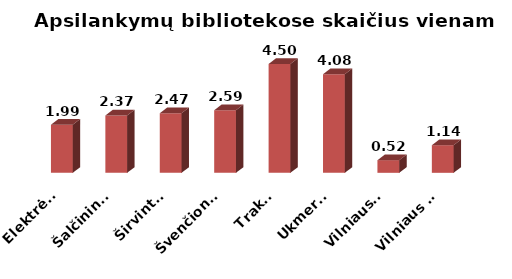
| Category | Series 0 |
|---|---|
|  Elektrėnai | 1.991 |
|  Šalčininkai | 2.374 |
|  Širvintos | 2.467 |
|  Švenčionys | 2.589 |
|  Trakai | 4.502 |
|  Ukmergė | 4.079 |
|  Vilniaus r. | 0.524 |
|  Vilniaus m. | 1.143 |